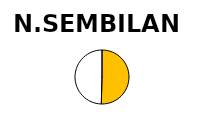
| Category | Series 1 | Series 0 |
|---|---|---|
| Operational Capacity (MW) | 61 | 33.996 |
| In progress (MW) | 60 | 0 |